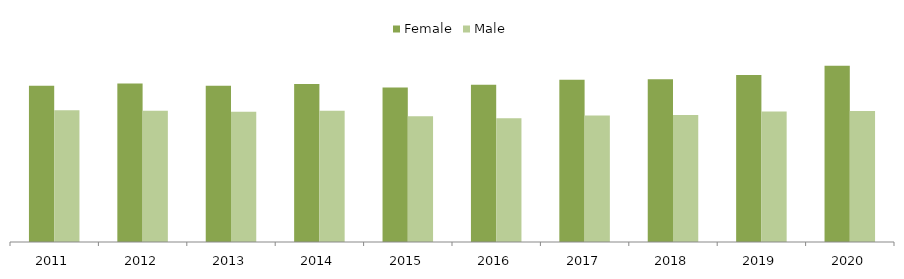
| Category | Female | Male |
|---|---|---|
| 2011 | 5411 | 4569 |
| 2012 | 5493 | 4551 |
| 2013 | 5416 | 4513 |
| 2014 | 5471 | 4550 |
| 2015 | 5352 | 4360 |
| 2016 | 5449 | 4285 |
| 2017 | 5626 | 4380 |
| 2018 | 5637 | 4398 |
| 2019 | 5790 | 4524 |
| 2020 | 6104 | 4539 |